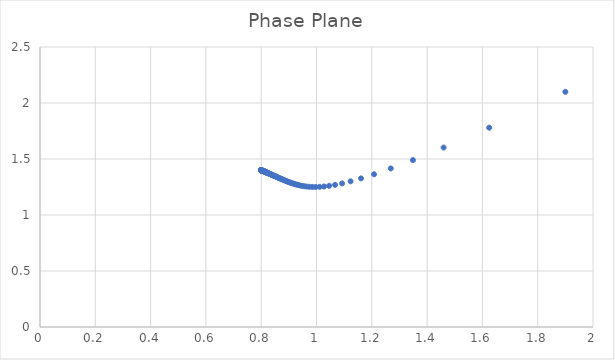
| Category | Series 0 |
|---|---|
| 1.9 | 2.1 |
| 1.6244999999999998 | 1.78 |
| 1.4597147812499998 | 1.602 |
| 1.3486641864214848 | 1.49 |
| 1.2685679000361667 | 1.416 |
| 1.2081346057675344 | 1.364 |
| 1.161020425548394 | 1.327 |
| 1.123349298408501 | 1.301 |
| 1.0926053441526515 | 1.282 |
| 1.0670792385357522 | 1.269 |
| 1.0455675756002845 | 1.26 |
| 1.0271987765139807 | 1.255 |
| 1.0113269430805063 | 1.251 |
| 0.9974643301572603 | 1.25 |
| 0.985236826280936 | 1.25 |
| 0.9743536974729585 | 1.252 |
| 0.9645864799232894 | 1.254 |
| 0.9557539181320747 | 1.257 |
| 0.947711003787958 | 1.26 |
| 0.9403408616537803 | 1.264 |
| 0.9335486534312758 | 1.268 |
| 0.9272569387096302 | 1.272 |
| 0.9214021055260375 | 1.276 |
| 0.9159315977253518 | 1.28 |
| 0.9108017436595033 | 1.284 |
| 0.9059760439392013 | 1.289 |
| 0.9014238131434138 | 1.293 |
| 0.8971190968358942 | 1.297 |
| 0.8930398043280772 | 1.301 |
| 0.889167011606101 | 1.304 |
| 0.8854843992107623 | 1.308 |
| 0.8819777976474097 | 1.312 |
| 0.8786348188161001 | 1.315 |
| 0.8754445564868787 | 1.319 |
| 0.8723973423532025 | 1.322 |
| 0.8694845469318916 | 1.325 |
| 0.8666984167254239 | 1.328 |
| 0.8640319407582476 | 1.331 |
| 0.8614787409448453 | 1.334 |
| 0.8590329818203372 | 1.336 |
| 0.8566892960229507 | 1.339 |
| 0.8544427226067283 | 1.342 |
| 0.8522886558172594 | 1.344 |
| 0.8502228024102955 | 1.346 |
| 0.8482411459542307 | 1.348 |
| 0.8463399168495875 | 1.35 |
| 0.8445155670352685 | 1.352 |
| 0.8427647485431892 | 1.354 |
| 0.8410842952185773 | 1.356 |
| 0.8394712070496297 | 1.358 |
| 0.8379226366529132 | 1.36 |
| 0.8364358775443713 | 1.361 |
| 0.8350083538936808 | 1.363 |
| 0.8336376115149163 | 1.364 |
| 0.8323213098914188 | 1.366 |
| 0.8310572150693369 | 1.367 |
| 0.829843193284093 | 1.368 |
| 0.8286772052082869 | 1.37 |
| 0.8275573007293161 | 1.371 |
| 0.8264816141811033 | 1.372 |
| 0.8254483599674701 | 1.373 |
| 0.8244558285254121 | 1.374 |
| 0.8235023825852944 | 1.375 |
| 0.8225864536921378 | 1.376 |
| 0.8217065389580209 | 1.377 |
| 0.8208611980204165 | 1.378 |
| 0.8200490501852062 | 1.379 |
| 0.8192687717363495 | 1.38 |
| 0.8185190933968283 | 1.381 |
| 0.8177987979276836 | 1.381 |
| 0.81710671785376 | 1.382 |
| 0.8164417333062742 | 1.383 |
| 0.815802769973566 | 1.383 |
| 0.8151887971524249 | 1.384 |
| 0.8145988258932544 | 1.385 |
| 0.8140319072330668 | 1.385 |
| 0.8134871305109128 | 1.386 |
| 0.8129636217608762 | 1.386 |
| 0.8124605421782122 | 1.387 |
| 0.8119770866545853 | 1.387 |
| 0.811512482378702 | 1.388 |
| 0.8110659874989138 | 1.388 |
| 0.8106368898446261 | 1.389 |
| 0.8102245057035663 | 1.389 |
| 0.8098281786521636 | 1.39 |
| 0.8094472784364702 | 1.39 |
| 0.8090811999012122 | 1.391 |
| 0.8087293619647007 | 1.391 |
| 0.8083912066374677 | 1.391 |
| 0.8080661980826067 | 1.392 |
| 0.8077538217159116 | 1.392 |
| 0.8074535833440063 | 1.392 |
| 0.807165008338753 | 1.393 |
| 0.8068876408463146 | 1.393 |
| 0.806621043029326 | 1.393 |
| 0.8063647943407106 | 1.393 |
| 0.8061184908277436 | 1.394 |
| 0.8058817444650355 | 1.394 |
| 0.805654182515173 | 1.394 |
| 0.8054354469158099 | 1.394 |
| 0.8052251936920635 | 1.395 |
| 0.8050230923931193 | 1.395 |
| 0.8048288255520036 | 1.395 |
| 0.8046420881675261 | 1.395 |
| 0.8044625872074445 | 1.395 |
| 0.8042900411319436 | 1.396 |
| 0.8041241794365651 | 1.396 |
| 0.8039647422137604 | 1.396 |
| 0.803811479732278 | 1.396 |
| 0.8036641520336333 | 1.396 |
| 0.8035225285449383 | 1.396 |
| 0.8033863877074059 | 1.396 |
| 0.8032555166198695 | 1.397 |
| 0.8031297106966909 | 1.397 |
| 0.8030087733394558 | 1.397 |
| 0.8028925156218807 | 1.397 |
| 0.8027807559873856 | 1.397 |
| 0.8026733199588041 | 1.397 |
| 0.8025700398597297 | 1.397 |
| 0.8024707545470192 | 1.397 |
| 0.8023753091539907 | 1.398 |
| 0.8022835548438784 | 1.398 |
| 0.8021953485731229 | 1.398 |
| 0.802110552864093 | 1.398 |
| 0.8020290355868543 | 1.398 |
| 0.8019506697496147 | 1.398 |
| 0.8018753332974936 | 1.398 |
| 0.8018029089192763 | 1.398 |
| 0.8017332838618285 | 1.398 |
| 0.8016663497518617 | 1.398 |
| 0.8016020024247501 | 1.398 |
| 0.8015401417601162 | 1.398 |
| 0.8014806715239099 | 1.398 |
| 0.801423499216721 | 1.399 |
| 0.8013685359280733 | 1.399 |
| 0.8013156961964605 | 1.399 |
| 0.8012648978748931 | 1.399 |
| 0.8012160620017361 | 1.399 |
| 0.801169112676625 | 1.399 |
| 0.8011239769412575 | 1.399 |
| 0.801080584664866 | 1.399 |
| 0.8010388684341853 | 1.399 |
| 0.8009987634477345 | 1.399 |
| 0.8009602074142435 | 1.399 |
| 0.8009231404550575 | 1.399 |
| 0.8008875050103638 | 1.399 |
| 0.8008532457490861 | 1.399 |
| 0.8008203094823051 | 1.399 |
| 0.8007886450800618 | 1.399 |
| 0.8007582033914122 | 1.399 |
| 0.8007289371676046 | 1.399 |
| 0.8007008009882546 | 1.399 |
| 0.8006737511904022 | 1.399 |
| 0.8006477458003348 | 1.399 |
| 0.8006227444680691 | 1.399 |
| 0.8005987084043857 | 1.399 |
| 0.8005756003203176 | 1.399 |
| 0.8005533843689944 | 1.399 |
| 0.8005320260897513 | 1.399 |
| 0.800511492354413 | 1.399 |
| 0.8004917513156673 | 1.399 |
| 0.800472772357447 | 1.4 |
| 0.8004545260472405 | 1.4 |
| 0.8004369840902572 | 1.4 |
| 0.8004201192853726 | 1.4 |
| 0.800403905482786 | 1.4 |
| 0.8003883175433222 | 1.4 |
| 0.8003733312993142 | 1.4 |
| 0.8003589235170037 | 1.4 |
| 0.8003450718604009 | 1.4 |
| 0.8003317548565478 | 1.4 |
| 0.8003189518621276 | 1.4 |
| 0.8003066430313702 | 1.4 |
| 0.800294809285202 | 1.4 |
| 0.800283432281592 | 1.4 |
| 0.8002724943870472 | 1.4 |
| 0.8002619786492127 | 1.4 |
| 0.8002518687705341 | 1.4 |
| 0.8002421490829402 | 1.4 |
| 0.800232804523506 | 1.4 |
| 0.8002238206110585 | 1.4 |
| 0.800215183423689 | 1.4 |
| 0.8002068795771362 | 1.4 |
| 0.8001988962040051 | 1.4 |
| 0.8001912209337918 | 1.4 |
| 0.8001838418736806 | 1.4 |
| 0.8001767475900848 | 1.4 |
| 0.8001699270909015 | 1.4 |
| 0.8001633698084529 | 1.4 |
| 0.8001570655830883 | 1.4 |
| 0.8001510046474197 | 1.4 |
| 0.8001451776111677 | 1.4 |
| 0.800139575446593 | 1.4 |
| 0.8001341894744921 | 1.4 |
| 0.8001290113507341 | 1.4 |
| 0.8001240330533177 | 1.4 |
| 0.8001192468699295 | 1.4 |
| 0.8001146453859829 | 1.4 |
| 0.8001102214731189 | 1.4 |
| 0.8001059682781526 | 1.4 |
| 0.8001018792124458 | 1.4 |
| 0.800097947941691 | 1.4 |
| 0.8000941683760898 | 1.4 |
| 0.8000905346609116 | 1.4 |
| 0.8000870411674164 | 1.4 |
| 0.8000836824841282 | 1.4 |
| 0.8000804534084468 | 1.4 |
| 0.8000773489385824 | 1.4 |
| 0.8000743642658024 | 1.4 |
| 0.8000714947669777 | 1.4 |
| 0.8000687359974168 | 1.4 |
| 0.8000660836839768 | 1.4 |
| 0.8000635337184409 | 1.4 |
| 0.8000610821511505 | 1.4 |
| 0.800058725184885 | 1.4 |
| 0.8000564591689764 | 1.4 |
| 0.8000542805936521 | 1.4 |
| 0.800052186084596 | 1.4 |
| 0.8000501723977197 | 1.4 |
| 0.8000482364141349 | 1.4 |
| 0.8000463751353215 | 1.4 |
| 0.8000445856784806 | 1.4 |
| 0.800042865272068 | 1.4 |
| 0.8000412112515 | 1.4 |
| 0.8000396210550244 | 1.4 |
| 0.8000380922197519 | 1.4 |
| 0.8000366223778399 | 1.4 |
| 0.8000352092528241 | 1.4 |
| 0.8000338506560917 | 1.4 |
| 0.8000325444834903 | 1.4 |
| 0.8000312887120682 | 1.4 |
| 0.8000300813969409 | 1.4 |
| 0.8000289206682772 | 1.4 |
| 0.8000278047284035 | 1.4 |
| 0.800026731849018 | 1.4 |
| 0.800025700368514 | 1.4 |
| 0.8000247086894056 | 1.4 |
| 0.800023755275853 | 1.4 |
| 0.8000228386512839 | 1.4 |
| 0.8000219573961054 | 1.4 |
| 0.8000211101455056 | 1.4 |
| 0.8000202955873392 | 1.4 |
| 0.8000195124600952 | 1.4 |
| 0.8000187595509425 | 1.4 |
| 0.8000180356938517 | 1.4 |
| 0.8000173397677884 | 1.4 |
| 0.8000166706949775 | 1.4 |
| 0.8000160274392331 | 1.4 |
| 0.8000154090043539 | 1.4 |
| 0.8000148144325803 | 1.4 |
| 0.8000142428031104 | 1.4 |
| 0.8000136932306744 | 1.4 |
| 0.800013164864163 | 1.4 |
| 0.8000126568853093 | 1.4 |
| 0.8000121685074215 | 1.4 |
| 0.8000116989741642 | 1.4 |
| 0.8000112475583873 | 1.4 |
| 0.8000108135609992 | 1.4 |
| 0.8000103963098849 | 1.4 |
| 0.8000099951588642 | 1.4 |
| 0.8000096094866913 | 1.4 |
| 0.8000092386960925 | 1.4 |
| 0.8000088822128414 | 1.4 |
| 0.8000085394848689 | 1.4 |
| 0.800008209981409 | 1.4 |
| 0.8000078931921761 | 1.4 |
| 0.8000075886265752 | 1.4 |
| 0.8000072958129416 | 1.4 |
| 0.8000070142978107 | 1.4 |
| 0.8000067436452158 | 1.4 |
| 0.8000064834360128 | 1.4 |
| 0.8000062332672305 | 1.4 |
| 0.8000059927514476 | 1.4 |
| 0.8000057615161916 | 1.4 |
| 0.8000055392033629 | 1.4 |
| 0.8000053254686794 | 1.4 |
| 0.8000051199811438 | 1.4 |
| 0.8000049224225307 | 1.4 |
| 0.8000047324868943 | 1.4 |
| 0.8000045498800936 | 1.4 |
| 0.8000043743193378 | 1.4 |
| 0.8000042055327479 | 1.4 |
| 0.8000040432589356 | 1.4 |
| 0.8000038872465988 | 1.4 |
| 0.8000037372541321 | 1.4 |
| 0.800003593049253 | 1.4 |
| 0.8000034544086414 | 1.4 |
| 0.8000033211175949 | 1.4 |
| 0.8000031929696951 | 1.4 |
| 0.800003069766489 | 1.4 |
| 0.8000029513171808 | 1.4 |
| 0.8000028374383369 | 1.4 |
| 0.8000027279536016 | 1.4 |
| 0.8000026226934243 | 1.4 |
| 0.8000025214947964 | 1.4 |
| 0.8000024242009995 | 1.4 |
| 0.8000023306613622 | 1.4 |
| 0.8000022407310268 | 1.4 |
| 0.8000021542707252 | 1.4 |
| 0.8000020711465631 | 1.4 |
| 0.8000019912298126 | 1.4 |
| 0.8000019143967132 | 1.4 |
| 0.8000018405282793 | 1.4 |
| 0.8000017695101168 | 1.4 |
| 0.8000017012322457 | 1.4 |
| 0.8000016355889293 | 1.4 |
| 0.8000015724785113 | 1.4 |
| 0.8000015118032576 | 1.4 |
| 0.8000014534692054 | 1.4 |
| 0.8000013973860175 | 1.4 |
| 0.8000013434668424 | 1.4 |
| 0.8000012916281799 | 1.4 |
| 0.8000012417897518 | 1.4 |
| 0.8000011938743775 | 1.4 |
| 0.8000011478078543 | 1.4 |
| 0.8000011035188428 | 1.4 |
| 0.8000010609387563 | 1.4 |
| 0.8000010200016546 | 1.4 |
| 0.8000009806441418 | 1.4 |
| 0.8000009428052682 | 1.4 |
| 0.8000009064264361 | 1.4 |
| 0.8000008714513084 | 1.4 |
| 0.8000008378257222 | 1.4 |
| 0.8000008054976043 | 1.4 |
| 0.800000774416891 | 1.4 |
| 0.8000007445354501 | 1.4 |
| 0.8000007158070068 | 1.4 |
| 0.8000006881870718 | 1.4 |
| 0.8000006616328725 | 1.4 |
| 0.8000006361032866 | 1.4 |
| 0.8000006115587787 | 1.4 |
| 0.8000005879613387 | 1.4 |
| 0.8000005652744233 | 1.4 |
| 0.8000005434628993 | 1.4 |
| 0.800000522492989 | 1.4 |
| 0.8000005023322181 | 1.4 |
| 0.8000004829493653 | 1.4 |
| 0.8000004643144142 | 1.4 |
| 0.8000004463985063 | 1.4 |
| 0.8000004291738968 | 1.4 |
| 0.8000004126139115 | 1.4 |
| 0.8000003966929053 | 1.4 |
| 0.8000003813862228 | 1.4 |
| 0.8000003666701597 | 1.4 |
| 0.8000003525219267 | 1.4 |
| 0.8000003389196136 | 1.4 |
| 0.8000003258421556 | 1.4 |
| 0.8000003132693009 | 1.4 |
| 0.8000003011815789 | 1.4 |
| 0.8000002895602705 | 1.4 |
| 0.8000002783873786 | 1.4 |
| 0.800000267645601 | 1.4 |
| 0.8000002573183026 | 1.4 |
| 0.8000002473894905 | 1.4 |
| 0.8000002378437888 | 1.4 |
| 0.800000228666415 | 1.4 |
| 0.8000002198431567 | 1.4 |
| 0.8000002113603503 | 1.4 |
| 0.8000002032048591 | 1.4 |
| 0.8000001953640534 | 1.4 |
| 0.8000001878257909 | 1.4 |
| 0.8000001805783976 | 1.4 |
| 0.8000001736106503 | 1.4 |
| 0.8000001669117586 | 1.4 |
| 0.8000001604713484 | 1.4 |
| 0.800000154279446 | 1.4 |
| 0.8000001483264627 | 1.4 |
| 0.8000001426031796 | 1.4 |
| 0.8000001371007335 | 1.4 |
| 0.8000001318106033 | 1.4 |
| 0.8000001267245965 | 1.4 |
| 0.800000121834837 | 1.4 |
| 0.8000001171337524 | 1.4 |
| 0.8000001126140625 | 1.4 |
| 0.800000108268768 | 1.4 |
| 0.8000001040911399 | 1.4 |
| 0.8000001000747086 | 1.4 |
| 0.8000000962132541 | 1.4 |
| 0.8000000925007966 | 1.4 |
| 0.800000088931587 | 1.4 |
| 0.8000000855000979 | 1.4 |
| 0.8000000822010154 | 1.4 |
| 0.8000000790292302 | 1.4 |
| 0.8000000759798307 | 1.4 |
| 0.8000000730480944 | 1.4 |
| 0.8000000702294813 | 1.4 |
| 0.8000000675196264 | 1.4 |
| 0.8000000649143332 | 1.4 |
| 0.8000000624095671 | 1.4 |
| 0.8000000600014492 | 1.4 |
| 0.8000000576862503 | 1.4 |
| 0.800000055460385 | 1.4 |
| 0.8000000533204062 | 1.4 |
| 0.8000000512630001 | 1.4 |
| 0.8000000492849805 | 1.4 |
| 0.8000000473832842 | 1.4 |
| 0.8000000455549663 | 1.4 |
| 0.8000000437971952 | 1.4 |
| 0.8000000421072491 | 1.4 |
| 0.8000000404825107 | 1.4 |
| 0.800000038920464 | 1.4 |
| 0.80000003741869 | 1.4 |
| 0.800000035974863 | 1.4 |
| 0.8000000345867472 | 1.4 |
| 0.8000000332521927 | 1.4 |
| 0.800000031969133 | 1.4 |
| 0.8000000307355811 | 1.4 |
| 0.8000000295496267 | 1.4 |
| 0.8000000284094332 | 1.4 |
| 0.8000000273132348 | 1.4 |
| 0.8000000262593341 | 1.4 |
| 0.8000000252460989 | 1.4 |
| 0.8000000242719602 | 1.4 |
| 0.8000000233354092 | 1.4 |
| 0.8000000224349957 | 1.4 |
| 0.8000000215693253 | 1.4 |
| 0.8000000207370574 | 1.4 |
| 0.8000000199369033 | 1.4 |
| 0.8000000191676236 | 1.4 |
| 0.8000000184280271 | 1.4 |
| 0.8000000177169685 | 1.4 |
| 0.8000000170333466 | 1.4 |
| 0.8000000163761026 | 1.4 |
| 0.800000015744219 | 1.4 |
| 0.800000015136717 | 1.4 |
| 0.800000014552656 | 1.4 |
| 0.8000000139911314 | 1.4 |
| 0.8000000134512736 | 1.4 |
| 0.8000000129322465 | 1.4 |
| 0.8000000124332466 | 1.4 |
| 0.8000000119535009 | 1.4 |
| 0.8000000114922665 | 1.4 |
| 0.8000000110488292 | 1.4 |
| 0.8000000106225023 | 1.4 |
| 0.8000000102126253 | 1.4 |
| 0.8000000098185639 | 1.4 |
| 0.8000000094397076 | 1.4 |
| 0.8000000090754698 | 1.4 |
| 0.8000000087252862 | 1.4 |
| 0.8000000083886147 | 1.4 |
| 0.800000008064934 | 1.4 |
| 0.8000000077537427 | 1.4 |
| 0.800000007454559 | 1.4 |
| 0.8000000071669195 | 1.4 |
| 0.8000000068903789 | 1.4 |
| 0.8000000066245087 | 1.4 |
| 0.8000000063688972 | 1.4 |
| 0.8000000061231488 | 1.4 |
| 0.8000000058868827 | 1.4 |
| 0.8000000056597331 | 1.4 |
| 0.8000000054413482 | 1.4 |
| 0.8000000052313899 | 1.4 |
| 0.800000005029533 | 1.4 |
| 0.8000000048354649 | 1.4 |
| 0.800000004648885 | 1.4 |
| 0.8000000044695045 | 1.4 |
| 0.8000000042970454 | 1.4 |
| 0.8000000041312408 | 1.4 |
| 0.8000000039718339 | 1.4 |
| 0.8000000038185778 | 1.4 |
| 0.8000000036712352 | 1.4 |
| 0.800000003529578 | 1.4 |
| 0.8000000033933867 | 1.4 |
| 0.8000000032624505 | 1.4 |
| 0.8000000031365665 | 1.4 |
| 0.8000000030155399 | 1.4 |
| 0.8000000028991832 | 1.4 |
| 0.8000000027873161 | 1.4 |
| 0.8000000026797655 | 1.4 |
| 0.8000000025763648 | 1.4 |
| 0.8000000024769539 | 1.4 |
| 0.8000000023813789 | 1.4 |
| 0.8000000022894918 | 1.4 |
| 0.8000000022011501 | 1.4 |
| 0.8000000021162171 | 1.4 |
| 0.8000000020345613 | 1.4 |
| 0.8000000019560564 | 1.4 |
| 0.8000000018805805 | 1.4 |
| 0.800000001808017 | 1.4 |
| 0.8000000017382534 | 1.4 |
| 0.8000000016711816 | 1.4 |
| 0.8000000016066978 | 1.4 |
| 0.8000000015447022 | 1.4 |
| 0.8000000014850988 | 1.4 |
| 0.8000000014277951 | 1.4 |
| 0.8000000013727027 | 1.4 |
| 0.8000000013197359 | 1.4 |
| 0.800000001268813 | 1.4 |
| 0.8000000012198549 | 1.4 |
| 0.8000000011727859 | 1.4 |
| 0.8000000011275331 | 1.4 |
| 0.8000000010840265 | 1.4 |
| 0.8000000010421986 | 1.4 |
| 0.8000000010019847 | 1.4 |
| 0.8000000009633224 | 1.4 |
| 0.8000000009261519 | 1.4 |
| 0.8000000008904157 | 1.4 |
| 0.8000000008560584 | 1.4 |
| 0.8000000008230268 | 1.4 |
| 0.8000000007912698 | 1.4 |
| 0.8000000007607381 | 1.4 |
| 0.8000000007313844 | 1.4 |
| 0.8000000007031635 | 1.4 |
| 0.8000000006760314 | 1.4 |
| 0.8000000006499463 | 1.4 |
| 0.8000000006248676 | 1.4 |
| 0.8000000006007567 | 1.4 |
| 0.800000000577576 | 1.4 |
| 0.8000000005552899 | 1.4 |
| 0.8000000005338636 | 1.4 |
| 0.800000000513264 | 1.4 |
| 0.8000000004934594 | 1.4 |
| 0.800000000474419 | 1.4 |
| 0.8000000004561132 | 1.4 |
| 0.8000000004385137 | 1.4 |
| 0.8000000004215934 | 1.4 |
| 0.8000000004053259 | 1.4 |
| 0.8000000003896861 | 1.4 |
| 0.8000000003746498 | 1.4 |
| 0.8000000003601937 | 1.4 |
| 0.8000000003462954 | 1.4 |
| 0.8000000003329333 | 1.4 |
| 0.8000000003200868 | 1.4 |
| 0.800000000307736 | 1.4 |
| 0.8000000002958618 | 1.4 |
| 0.8000000002844457 | 1.4 |
| 0.8000000002734702 | 1.4 |
| 0.8000000002629182 | 1.4 |
| 0.8000000002527733 | 1.4 |
| 0.8000000002430199 | 1.4 |
| 0.8000000002336428 | 1.4 |
| 0.8000000002246276 | 1.4 |
| 0.8000000002159602 | 1.4 |
| 0.8000000002076272 | 1.4 |
| 0.8000000001996157 | 1.4 |
| 0.8000000001919134 | 1.4 |
| 0.8000000001845083 | 1.4 |
| 0.8000000001773889 | 1.4 |
| 0.8000000001705443 | 1.4 |
| 0.8000000001639637 | 1.4 |
| 0.8000000001576371 | 1.4 |
| 0.8000000001515545 | 1.4 |
| 0.8000000001457066 | 1.4 |
| 0.8000000001400844 | 1.4 |
| 0.8000000001346792 | 1.4 |
| 0.8000000001294825 | 1.4 |
| 0.8000000001244862 | 1.4 |
| 0.8000000001196829 | 1.4 |
| 0.8000000001150648 | 1.4 |
| 0.8000000001106249 | 1.4 |
| 0.8000000001063563 | 1.4 |
| 0.8000000001022525 | 1.4 |
| 0.800000000098307 | 1.4 |
| 0.8000000000945138 | 1.4 |
| 0.8000000000908669 | 1.4 |
| 0.8000000000873607 | 1.4 |
| 0.8000000000839899 | 1.4 |
| 0.800000000080749 | 1.4 |
| 0.8000000000776333 | 1.4 |
| 0.8000000000746378 | 1.4 |
| 0.8000000000717579 | 1.4 |
| 0.8000000000689891 | 1.4 |
| 0.8000000000663271 | 1.4 |
| 0.8000000000637678 | 1.4 |
| 0.8000000000613073 | 1.4 |
| 0.8000000000589418 | 1.4 |
| 0.8000000000566675 | 1.4 |
| 0.8000000000544809 | 1.4 |
| 0.8000000000523787 | 1.4 |
| 0.8000000000503577 | 1.4 |
| 0.8000000000484145 | 1.4 |
| 0.8000000000465465 | 1.4 |
| 0.8000000000447505 | 1.4 |
| 0.8000000000430237 | 1.4 |
| 0.8000000000413636 | 1.4 |
| 0.8000000000397676 | 1.4 |
| 0.8000000000382331 | 1.4 |
| 0.8000000000367579 | 1.4 |
| 0.8000000000353396 | 1.4 |
| 0.800000000033976 | 1.4 |
| 0.800000000032665 | 1.4 |
| 0.8000000000314046 | 1.4 |
| 0.8000000000301928 | 1.4 |
| 0.8000000000290278 | 1.4 |
| 0.8000000000279077 | 1.4 |
| 0.8000000000268309 | 1.4 |
| 0.8000000000257956 | 1.4 |
| 0.8000000000248003 | 1.4 |
| 0.8000000000238434 | 1.4 |
| 0.8000000000229234 | 1.4 |
| 0.8000000000220389 | 1.4 |
| 0.8000000000211884 | 1.4 |
| 0.8000000000203709 | 1.4 |
| 0.8000000000195848 | 1.4 |
| 0.8000000000188291 | 1.4 |
| 0.8000000000181026 | 1.4 |
| 0.8000000000174041 | 1.4 |
| 0.8000000000167325 | 1.4 |
| 0.800000000016087 | 1.4 |
| 0.8000000000154662 | 1.4 |
| 0.8000000000148695 | 1.4 |
| 0.8000000000142957 | 1.4 |
| 0.8000000000137442 | 1.4 |
| 0.8000000000132138 | 1.4 |
| 0.800000000012704 | 1.4 |
| 0.8000000000122138 | 1.4 |
| 0.8000000000117425 | 1.4 |
| 0.8000000000112895 | 1.4 |
| 0.8000000000108538 | 1.4 |
| 0.800000000010435 | 1.4 |
| 0.8000000000100324 | 1.4 |
| 0.8000000000096452 | 1.4 |
| 0.8000000000092731 | 1.4 |
| 0.8000000000089152 | 1.4 |
| 0.8000000000085713 | 1.4 |
| 0.8000000000082406 | 1.4 |
| 0.8000000000079226 | 1.4 |
| 0.8000000000076168 | 1.4 |
| 0.800000000007323 | 1.4 |
| 0.8000000000070404 | 1.4 |
| 0.8000000000067687 | 1.4 |
| 0.8000000000065076 | 1.4 |
| 0.8000000000062565 | 1.4 |
| 0.8000000000060151 | 1.4 |
| 0.800000000005783 | 1.4 |
| 0.8000000000055598 | 1.4 |
| 0.8000000000053453 | 1.4 |
| 0.800000000005139 | 1.4 |
| 0.8000000000049408 | 1.4 |
| 0.8000000000047501 | 1.4 |
| 0.8000000000045668 | 1.4 |
| 0.8000000000043906 | 1.4 |
| 0.8000000000042212 | 1.4 |
| 0.8000000000040584 | 1.4 |
| 0.8000000000039017 | 1.4 |
| 0.8000000000037512 | 1.4 |
| 0.8000000000036064 | 1.4 |
| 0.8000000000034673 | 1.4 |
| 0.8000000000033335 | 1.4 |
| 0.8000000000032048 | 1.4 |
| 0.8000000000030811 | 1.4 |
| 0.8000000000029622 | 1.4 |
| 0.8000000000028479 | 1.4 |
| 0.800000000002738 | 1.4 |
| 0.8000000000026323 | 1.4 |
| 0.8000000000025307 | 1.4 |
| 0.800000000002433 | 1.4 |
| 0.8000000000023391 | 1.4 |
| 0.8000000000022488 | 1.4 |
| 0.800000000002162 | 1.4 |
| 0.8000000000020786 | 1.4 |
| 0.8000000000019984 | 1.4 |
| 0.8000000000019213 | 1.4 |
| 0.8000000000018471 | 1.4 |
| 0.8000000000017758 | 1.4 |
| 0.8000000000017073 | 1.4 |
| 0.8000000000016415 | 1.4 |
| 0.8000000000015782 | 1.4 |
| 0.8000000000015174 | 1.4 |
| 0.8000000000014589 | 1.4 |
| 0.8000000000014026 | 1.4 |
| 0.8000000000013485 | 1.4 |
| 0.8000000000012965 | 1.4 |
| 0.8000000000012464 | 1.4 |
| 0.8000000000011983 | 1.4 |
| 0.8000000000011521 | 1.4 |
| 0.8000000000011077 | 1.4 |
| 0.800000000001065 | 1.4 |
| 0.8000000000010239 | 1.4 |
| 0.8000000000009844 | 1.4 |
| 0.8000000000009464 | 1.4 |
| 0.8000000000009099 | 1.4 |
| 0.8000000000008748 | 1.4 |
| 0.800000000000841 | 1.4 |
| 0.8000000000008086 | 1.4 |
| 0.8000000000007774 | 1.4 |
| 0.8000000000007474 | 1.4 |
| 0.8000000000007186 | 1.4 |
| 0.8000000000006908 | 1.4 |
| 0.8000000000006642 | 1.4 |
| 0.8000000000006385 | 1.4 |
| 0.8000000000006139 | 1.4 |
| 0.8000000000005902 | 1.4 |
| 0.8000000000005675 | 1.4 |
| 0.8000000000005456 | 1.4 |
| 0.8000000000005245 | 1.4 |
| 0.8000000000005043 | 1.4 |
| 0.8000000000004849 | 1.4 |
| 0.8000000000004662 | 1.4 |
| 0.8000000000004482 | 1.4 |
| 0.8000000000004309 | 1.4 |
| 0.8000000000004143 | 1.4 |
| 0.8000000000003983 | 1.4 |
| 0.800000000000383 | 1.4 |
| 0.8000000000003682 | 1.4 |
| 0.800000000000354 | 1.4 |
| 0.8000000000003403 | 1.4 |
| 0.8000000000003272 | 1.4 |
| 0.8000000000003146 | 1.4 |
| 0.8000000000003025 | 1.4 |
| 0.8000000000002908 | 1.4 |
| 0.8000000000002796 | 1.4 |
| 0.8000000000002688 | 1.4 |
| 0.8000000000002585 | 1.4 |
| 0.8000000000002485 | 1.4 |
| 0.800000000000239 | 1.4 |
| 0.8000000000002297 | 1.4 |
| 0.8000000000002209 | 1.4 |
| 0.8000000000002123 | 1.4 |
| 0.8000000000002041 | 1.4 |
| 0.8000000000001962 | 1.4 |
| 0.8000000000001887 | 1.4 |
| 0.8000000000001813 | 1.4 |
| 0.8000000000001743 | 1.4 |
| 0.8000000000001676 | 1.4 |
| 0.8000000000001611 | 1.4 |
| 0.8000000000001549 | 1.4 |
| 0.8000000000001489 | 1.4 |
| 0.8000000000001432 | 1.4 |
| 0.8000000000001376 | 1.4 |
| 0.8000000000001323 | 1.4 |
| 0.8000000000001272 | 1.4 |
| 0.8000000000001223 | 1.4 |
| 0.8000000000001176 | 1.4 |
| 0.8000000000001131 | 1.4 |
| 0.8000000000001087 | 1.4 |
| 0.8000000000001045 | 1.4 |
| 0.8000000000001005 | 1.4 |
| 0.8000000000000966 | 1.4 |
| 0.8000000000000929 | 1.4 |
| 0.8000000000000893 | 1.4 |
| 0.8000000000000859 | 1.4 |
| 0.8000000000000825 | 1.4 |
| 0.8000000000000793 | 1.4 |
| 0.8000000000000762 | 1.4 |
| 0.8000000000000733 | 1.4 |
| 0.8000000000000705 | 1.4 |
| 0.8000000000000679 | 1.4 |
| 0.8000000000000652 | 1.4 |
| 0.8000000000000627 | 1.4 |
| 0.8000000000000602 | 1.4 |
| 0.8000000000000579 | 1.4 |
| 0.8000000000000557 | 1.4 |
| 0.8000000000000536 | 1.4 |
| 0.8000000000000514 | 1.4 |
| 0.8000000000000494 | 1.4 |
| 0.8000000000000476 | 1.4 |
| 0.8000000000000458 | 1.4 |
| 0.800000000000044 | 1.4 |
| 0.8000000000000423 | 1.4 |
| 0.8000000000000407 | 1.4 |